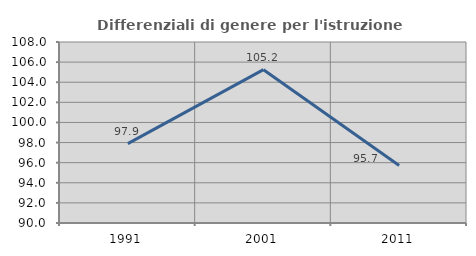
| Category | Differenziali di genere per l'istruzione superiore |
|---|---|
| 1991.0 | 97.894 |
| 2001.0 | 105.249 |
| 2011.0 | 95.711 |